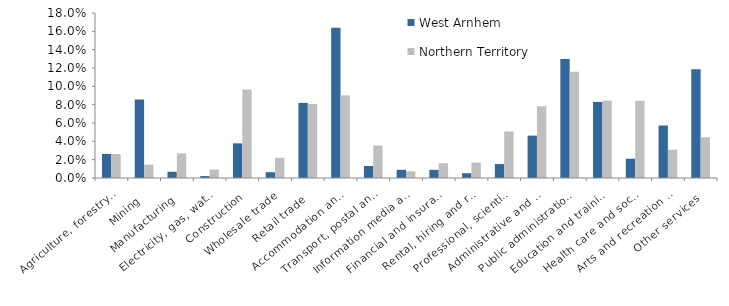
| Category | West Arnhem | Northern Territory |
|---|---|---|
| Agriculture, forestry and fishing | 0.026 | 0.026 |
| Mining | 0.086 | 0.015 |
| Manufacturing | 0.007 | 0.027 |
| Electricity, gas, water and waste services | 0.002 | 0.009 |
| Construction | 0.038 | 0.097 |
| Wholesale trade | 0.006 | 0.022 |
| Retail trade | 0.082 | 0.081 |
| Accommodation and food services | 0.164 | 0.09 |
| Transport, postal and warehousing | 0.013 | 0.035 |
| Information media and telecommunications | 0.009 | 0.007 |
| Financial and insurance services | 0.009 | 0.016 |
| Rental, hiring and real estate services | 0.005 | 0.017 |
| Professional, scientific and technical services | 0.015 | 0.051 |
| Administrative and support services | 0.046 | 0.078 |
| Public administration and safety | 0.13 | 0.116 |
| Education and training | 0.083 | 0.084 |
| Health care and social assistance | 0.021 | 0.084 |
| Arts and recreation services | 0.057 | 0.031 |
| Other services | 0.119 | 0.045 |